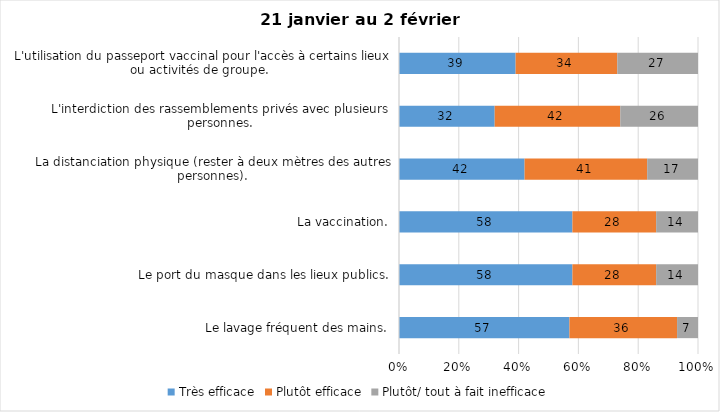
| Category | Très efficace | Plutôt efficace | Plutôt/ tout à fait inefficace |
|---|---|---|---|
| Le lavage fréquent des mains. | 57 | 36 | 7 |
| Le port du masque dans les lieux publics. | 58 | 28 | 14 |
| La vaccination. | 58 | 28 | 14 |
| La distanciation physique (rester à deux mètres des autres personnes). | 42 | 41 | 17 |
| L'interdiction des rassemblements privés avec plusieurs personnes. | 32 | 42 | 26 |
| L'utilisation du passeport vaccinal pour l'accès à certains lieux ou activités de groupe.  | 39 | 34 | 27 |